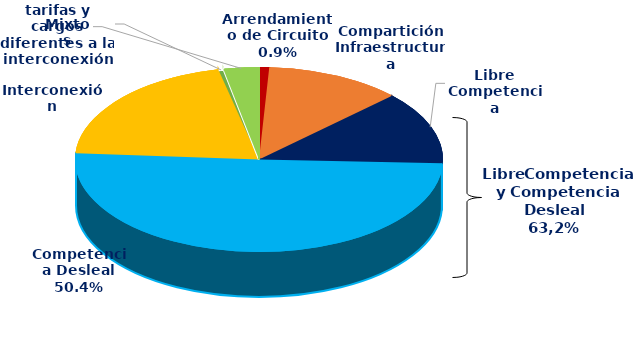
| Category | Series 0 |
|---|---|
| Arrendamiento de Circuito | 0.009 |
| Compartición Infraestructura | 0.119 |
| Libre Competencia | 0.128 |
| Competencia Desleal | 0.504 |
| Interconexión | 0.204 |
| tarifas y cargos diferentes a la interconexión | 0.004 |
| Mixtos | 0.031 |